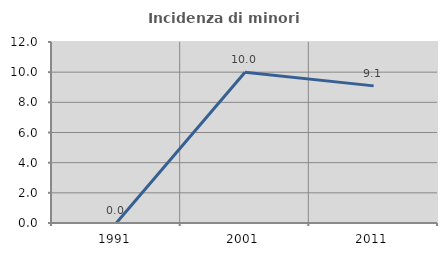
| Category | Incidenza di minori stranieri |
|---|---|
| 1991.0 | 0 |
| 2001.0 | 10 |
| 2011.0 | 9.091 |